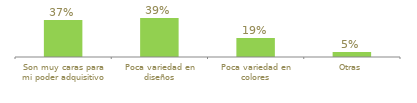
| Category | Series 0 |
|---|---|
| Son muy caras para mi poder adquisitivo | 0.37 |
| Poca variedad en diseños | 0.39 |
| Poca variedad en colores | 0.19 |
| Otras | 0.05 |